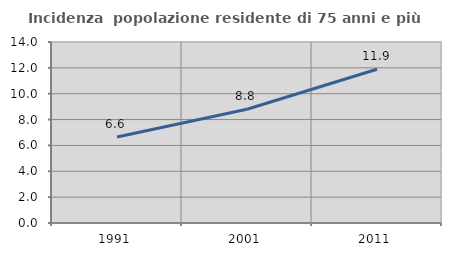
| Category | Incidenza  popolazione residente di 75 anni e più |
|---|---|
| 1991.0 | 6.646 |
| 2001.0 | 8.794 |
| 2011.0 | 11.889 |